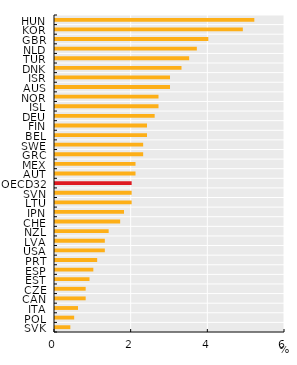
| Category | Series 0 |
|---|---|
| SVK | 0.4 |
| POL | 0.5 |
| ITA | 0.6 |
| CAN | 0.8 |
| CZE | 0.8 |
| EST | 0.9 |
| ESP | 1 |
| PRT | 1.1 |
| USA | 1.3 |
| LVA | 1.3 |
| NZL | 1.4 |
| CHE | 1.7 |
| JPN | 1.8 |
| LTU | 2 |
| SVN | 2 |
| OECD32 | 2 |
| AUT | 2.1 |
| MEX | 2.1 |
| GRC | 2.3 |
| SWE | 2.3 |
| BEL | 2.4 |
| FIN | 2.4 |
| DEU | 2.6 |
| ISL | 2.7 |
| NOR | 2.7 |
| AUS | 3 |
| ISR | 3 |
| DNK | 3.3 |
| TUR | 3.5 |
| NLD | 3.7 |
| GBR | 4 |
| KOR | 4.9 |
| HUN | 5.2 |